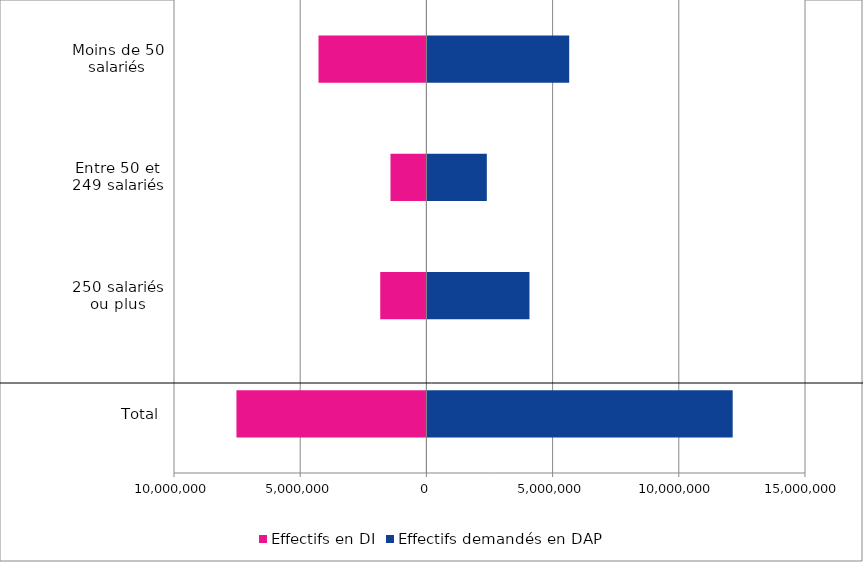
| Category | Effectifs en DI | Effectifs demandés en DAP |
|---|---|---|
| Total | -7525835 | 12134908 |
| 250 salariés ou plus | -1828356 | 4083503 |
| Entre 50 et 249 salariés | -1422556 | 2394051 |
| Moins de 50 salariés | -4274923 | 5657354 |